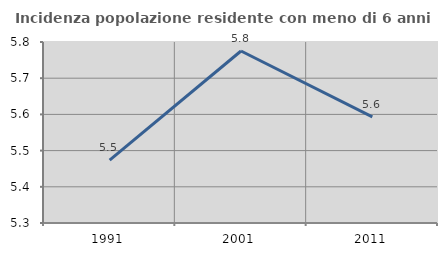
| Category | Incidenza popolazione residente con meno di 6 anni |
|---|---|
| 1991.0 | 5.474 |
| 2001.0 | 5.775 |
| 2011.0 | 5.593 |